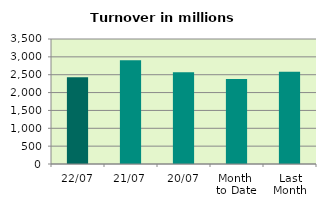
| Category | Series 0 |
|---|---|
| 22/07 | 2428.959 |
| 21/07 | 2905.93 |
| 20/07 | 2571.55 |
| Month 
to Date | 2382.589 |
| Last
Month | 2579.746 |